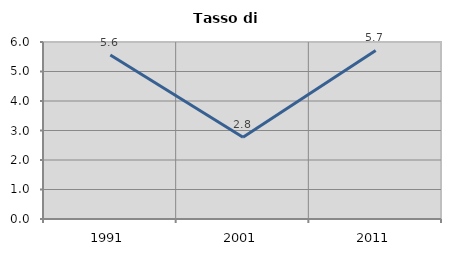
| Category | Tasso di disoccupazione   |
|---|---|
| 1991.0 | 5.56 |
| 2001.0 | 2.769 |
| 2011.0 | 5.713 |